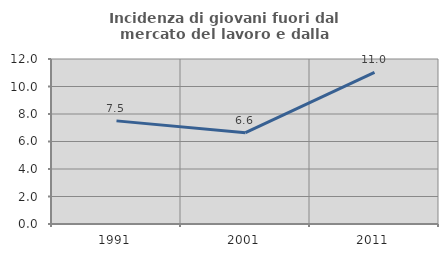
| Category | Incidenza di giovani fuori dal mercato del lavoro e dalla formazione  |
|---|---|
| 1991.0 | 7.5 |
| 2001.0 | 6.643 |
| 2011.0 | 11.02 |